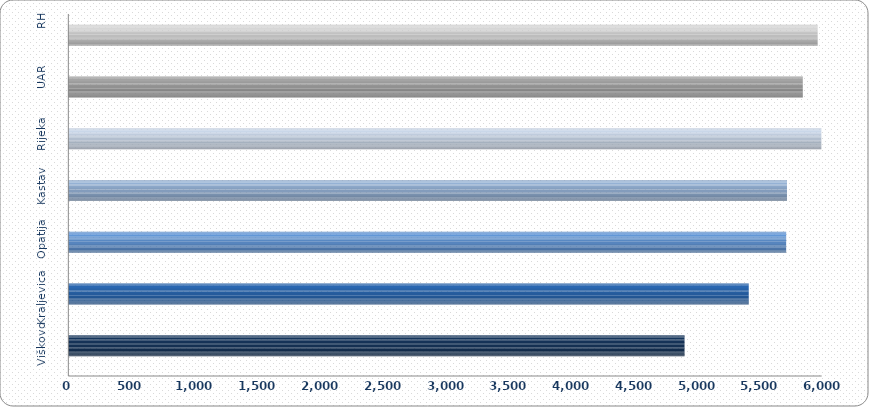
| Category | 4.911 5.422 5.720 5.727 6.089 5.852 5.971 |
|---|---|
| Viškovo | 4910.51 |
| Kraljevica | 5422.074 |
| Opatija | 5719.964 |
| Kastav | 5726.508 |
| Rijeka | 6088.922 |
| UAR | 5852.417 |
| RH | 5970.837 |